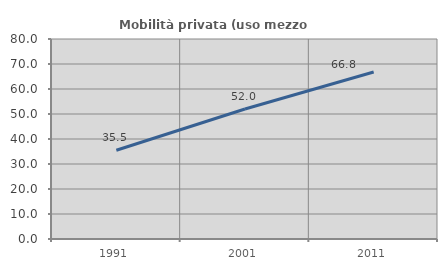
| Category | Mobilità privata (uso mezzo privato) |
|---|---|
| 1991.0 | 35.487 |
| 2001.0 | 52.017 |
| 2011.0 | 66.822 |